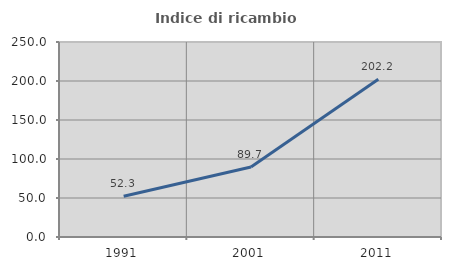
| Category | Indice di ricambio occupazionale  |
|---|---|
| 1991.0 | 52.288 |
| 2001.0 | 89.712 |
| 2011.0 | 202.222 |